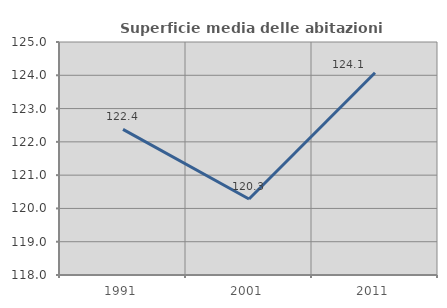
| Category | Superficie media delle abitazioni occupate |
|---|---|
| 1991.0 | 122.374 |
| 2001.0 | 120.284 |
| 2011.0 | 124.075 |